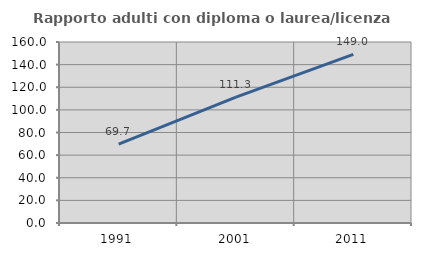
| Category | Rapporto adulti con diploma o laurea/licenza media  |
|---|---|
| 1991.0 | 69.661 |
| 2001.0 | 111.25 |
| 2011.0 | 149.038 |